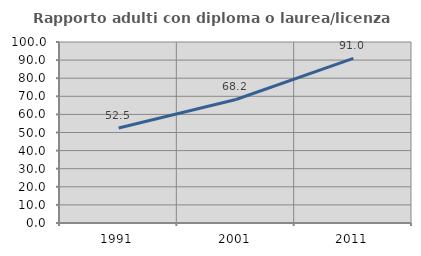
| Category | Rapporto adulti con diploma o laurea/licenza media  |
|---|---|
| 1991.0 | 52.521 |
| 2001.0 | 68.249 |
| 2011.0 | 90.956 |